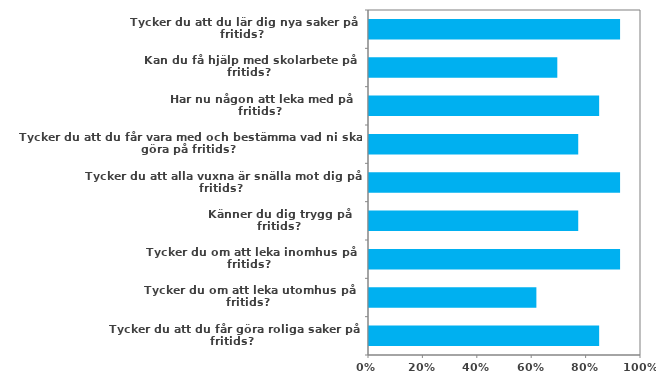
| Category | (Alla) |
|---|---|
| Tycker du att du lär dig nya saker på fritids? | 0.923 |
| Kan du få hjälp med skolarbete på fritids? | 0.692 |
| Har nu någon att leka med på fritids? | 0.846 |
| Tycker du att du får vara med och bestämma vad ni ska göra på fritids? | 0.769 |
| Tycker du att alla vuxna är snälla mot dig på fritids? | 0.923 |
| Känner du dig trygg på fritids? | 0.769 |
| Tycker du om att leka inomhus på fritids? | 0.923 |
| Tycker du om att leka utomhus på fritids? | 0.615 |
| Tycker du att du får göra roliga saker på fritids? | 0.846 |